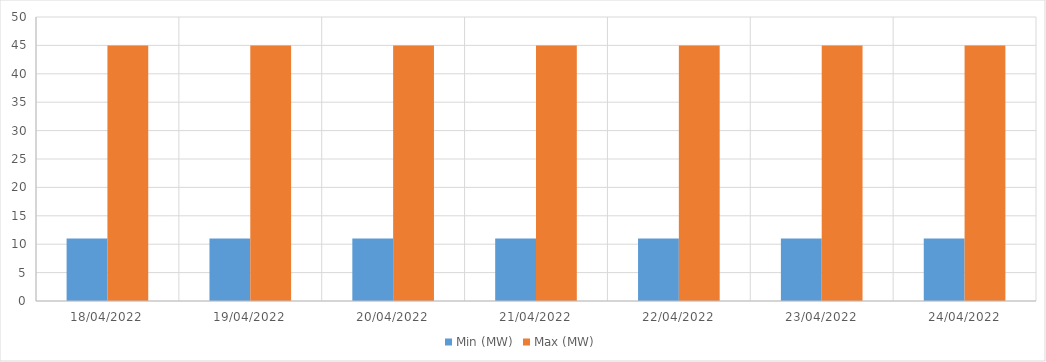
| Category | Min (MW) | Max (MW) |
|---|---|---|
| 18/04/2022 | 11 | 45 |
| 19/04/2022 | 11 | 45 |
| 20/04/2022 | 11 | 45 |
| 21/04/2022 | 11 | 45 |
| 22/04/2022 | 11 | 45 |
| 23/04/2022 | 11 | 45 |
| 24/04/2022 | 11 | 45 |